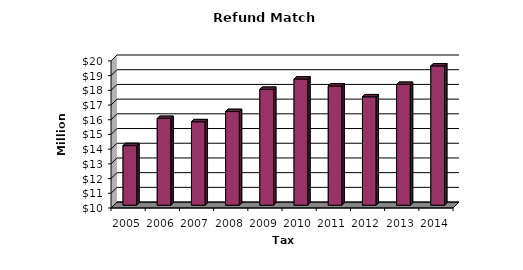
| Category | Total |
|---|---|
| 2005.0 | 14.052 |
| 2006.0 | 15.896 |
| 2007.0 | 15.673 |
| 2008.0 | 16.367 |
| 2009.0 | 17.876 |
| 2010.0 | 18.578 |
| 2011.0 | 18.105 |
| 2012.0 | 17.369 |
| 2013.0 | 18.212 |
| 2014.0 | 19.469 |